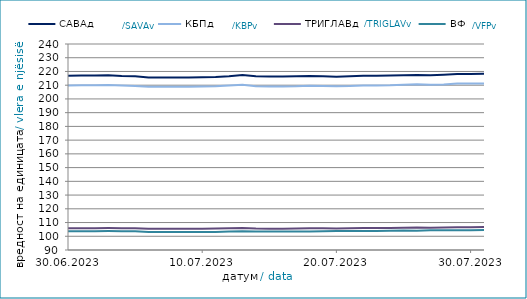
| Category | САВАд | КБПд | ТРИГЛАВд | ВФПд |
|---|---|---|---|---|
| 2023-06-30 | 216.891 | 209.726 | 105.793 | 103.673 |
| 2023-07-01 | 217.063 | 209.938 | 105.922 | 103.657 |
| 2023-07-02 | 217.07 | 209.946 | 105.928 | 103.663 |
| 2023-07-03 | 217.259 | 210.058 | 106.002 | 103.77 |
| 2023-07-04 | 216.775 | 209.774 | 105.888 | 103.665 |
| 2023-07-05 | 216.508 | 209.488 | 105.757 | 103.615 |
| 2023-07-06 | 215.695 | 208.789 | 105.46 | 103.132 |
| 2023-07-07 | 215.535 | 208.792 | 105.409 | 103.157 |
| 2023-07-08 | 215.599 | 208.862 | 105.445 | 103.174 |
| 2023-07-09 | 215.606 | 208.869 | 105.45 | 103.18 |
| 2023-07-10 | 215.843 | 209.035 | 105.547 | 103.101 |
| 2023-07-11 | 215.954 | 209.152 | 105.61 | 103.192 |
| 2023-07-12 | 216.449 | 209.712 | 105.841 | 103.398 |
| 2023-07-13 | 217.421 | 210.288 | 106.07 | 103.6 |
| 2023-07-14 | 216.473 | 209.26 | 105.589 | 103.493 |
| 2023-07-15 | 216.286 | 209.052 | 105.493 | 103.459 |
| 2023-07-16 | 216.294 | 209.06 | 105.498 | 103.465 |
| 2023-07-17 | 216.432 | 209.158 | 105.569 | 103.386 |
| 2023-07-18 | 216.711 | 209.511 | 105.753 | 103.519 |
| 2023-07-19 | 216.489 | 209.48 | 105.76 | 103.736 |
| 2023-07-20 | 216.223 | 209.224 | 105.694 | 103.747 |
| 2023-07-21 | 216.431 | 209.396 | 105.791 | 103.817 |
| 2023-07-22 | 216.798 | 209.806 | 105.989 | 103.896 |
| 2023-07-23 | 216.805 | 209.813 | 105.995 | 103.902 |
| 2023-07-24 | 216.978 | 209.964 | 106.085 | 104.011 |
| 2023-07-25 | 217.222 | 210.343 | 106.236 | 104.172 |
| 2023-07-26 | 217.498 | 210.654 | 106.385 | 104.069 |
| 2023-07-27 | 217.191 | 210.296 | 106.193 | 104.451 |
| 2023-07-28 | 217.619 | 210.524 | 106.307 | 104.301 |
| 2023-07-29 | 218.194 | 211.17 | 106.618 | 104.422 |
| 2023-07-30 | 218.201 | 211.178 | 106.624 | 104.428 |
| 2023-07-31 | 218.344 | 211.285 | 106.678 | 104.553 |